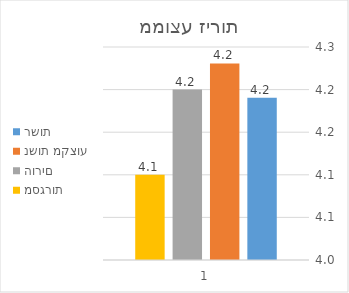
| Category | רשות | נשות מקצוע | הורים | מסגרות |
|---|---|---|---|---|
| 0 | 4.19 | 4.231 | 4.2 | 4.1 |